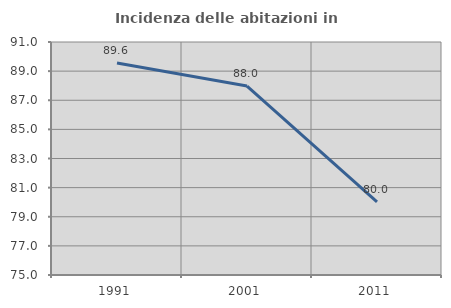
| Category | Incidenza delle abitazioni in proprietà  |
|---|---|
| 1991.0 | 89.556 |
| 2001.0 | 87.978 |
| 2011.0 | 80.029 |